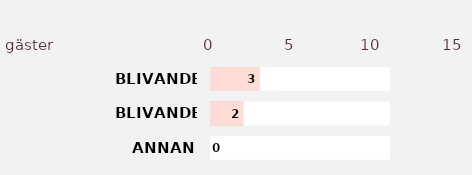
| Category | Series 2 | Series 3 | Series 1 | Series 0 |
|---|---|---|---|---|
| ANNAN | 11 | 0 | 11 | 0 |
| BLIVANDE MAKE/MAKA 2 | 11 | 2 | 11 | 2 |
| BLIVANDE MAKE/MAKA 1 | 11 | 3 | 11 | 3 |